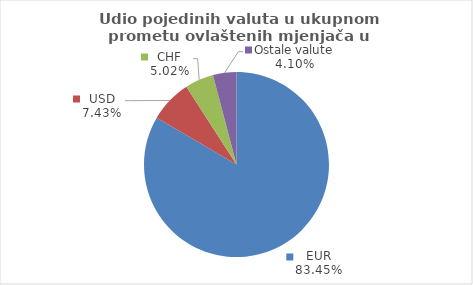
| Category | Series 0 |
|---|---|
| EUR | 83.448 |
| USD | 7.435 |
| CHF | 5.015 |
| Ostale valute | 4.103 |